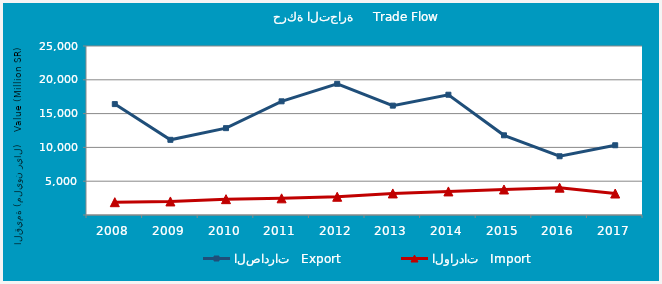
| Category | الصادرات   Export | الواردات   Import |
|---|---|---|
| 2008.0 | 16406147293 | 1894519407 |
| 2009.0 | 11120570240 | 2004493040 |
| 2010.0 | 12848719030 | 2341595378 |
| 2011.0 | 16816413996 | 2465969444 |
| 2012.0 | 19404158857 | 2697430216 |
| 2013.0 | 16178241454 | 3187606587 |
| 2014.0 | 17792327390 | 3486963024 |
| 2015.0 | 11788674070 | 3772547712 |
| 2016.0 | 8690750821 | 4041584138 |
| 2017.0 | 10317939373 | 3176491906 |